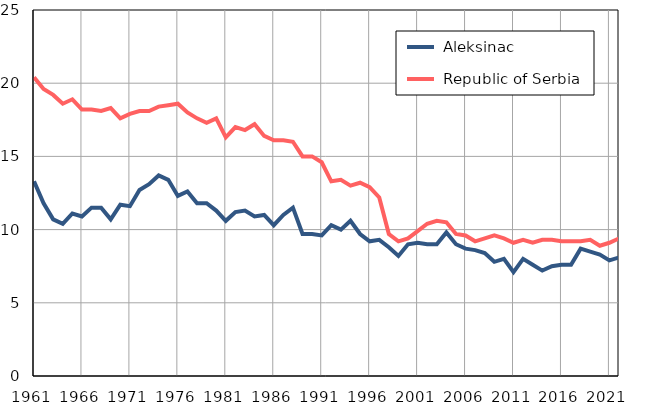
| Category |  Aleksinac |  Republic of Serbia |
|---|---|---|
| 1961.0 | 13.3 | 20.4 |
| 1962.0 | 11.8 | 19.6 |
| 1963.0 | 10.7 | 19.2 |
| 1964.0 | 10.4 | 18.6 |
| 1965.0 | 11.1 | 18.9 |
| 1966.0 | 10.9 | 18.2 |
| 1967.0 | 11.5 | 18.2 |
| 1968.0 | 11.5 | 18.1 |
| 1969.0 | 10.7 | 18.3 |
| 1970.0 | 11.7 | 17.6 |
| 1971.0 | 11.6 | 17.9 |
| 1972.0 | 12.7 | 18.1 |
| 1973.0 | 13.1 | 18.1 |
| 1974.0 | 13.7 | 18.4 |
| 1975.0 | 13.4 | 18.5 |
| 1976.0 | 12.3 | 18.6 |
| 1977.0 | 12.6 | 18 |
| 1978.0 | 11.8 | 17.6 |
| 1979.0 | 11.8 | 17.3 |
| 1980.0 | 11.3 | 17.6 |
| 1981.0 | 10.6 | 16.3 |
| 1982.0 | 11.2 | 17 |
| 1983.0 | 11.3 | 16.8 |
| 1984.0 | 10.9 | 17.2 |
| 1985.0 | 11 | 16.4 |
| 1986.0 | 10.3 | 16.1 |
| 1987.0 | 11 | 16.1 |
| 1988.0 | 11.5 | 16 |
| 1989.0 | 9.7 | 15 |
| 1990.0 | 9.7 | 15 |
| 1991.0 | 9.6 | 14.6 |
| 1992.0 | 10.3 | 13.3 |
| 1993.0 | 10 | 13.4 |
| 1994.0 | 10.6 | 13 |
| 1995.0 | 9.7 | 13.2 |
| 1996.0 | 9.2 | 12.9 |
| 1997.0 | 9.3 | 12.2 |
| 1998.0 | 8.8 | 9.7 |
| 1999.0 | 8.2 | 9.2 |
| 2000.0 | 9 | 9.4 |
| 2001.0 | 9.1 | 9.9 |
| 2002.0 | 9 | 10.4 |
| 2003.0 | 9 | 10.6 |
| 2004.0 | 9.8 | 10.5 |
| 2005.0 | 9 | 9.7 |
| 2006.0 | 8.7 | 9.6 |
| 2007.0 | 8.6 | 9.2 |
| 2008.0 | 8.4 | 9.4 |
| 2009.0 | 7.8 | 9.6 |
| 2010.0 | 8 | 9.4 |
| 2011.0 | 7.1 | 9.1 |
| 2012.0 | 8 | 9.3 |
| 2013.0 | 7.6 | 9.1 |
| 2014.0 | 7.2 | 9.3 |
| 2015.0 | 7.5 | 9.3 |
| 2016.0 | 7.6 | 9.2 |
| 2017.0 | 7.6 | 9.2 |
| 2018.0 | 8.7 | 9.2 |
| 2019.0 | 8.5 | 9.3 |
| 2020.0 | 8.3 | 8.9 |
| 2021.0 | 7.9 | 9.1 |
| 2022.0 | 8.1 | 9.4 |